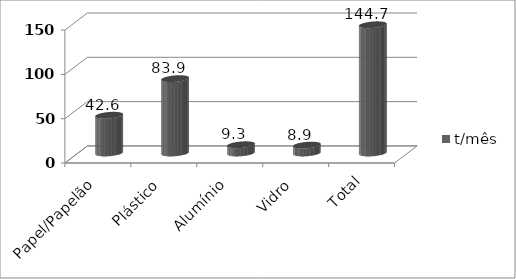
| Category | t/mês |
|---|---|
| Papel/Papelão | 42.6 |
| Plástico | 83.9 |
| Alumínio | 9.3 |
| Vidro | 8.9 |
| Total | 144.7 |